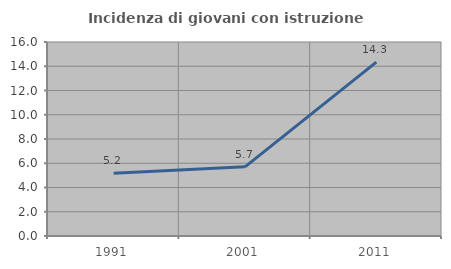
| Category | Incidenza di giovani con istruzione universitaria |
|---|---|
| 1991.0 | 5.178 |
| 2001.0 | 5.707 |
| 2011.0 | 14.334 |